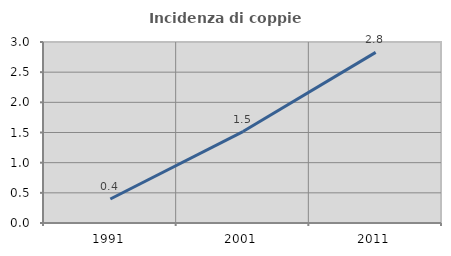
| Category | Incidenza di coppie miste |
|---|---|
| 1991.0 | 0.397 |
| 2001.0 | 1.516 |
| 2011.0 | 2.828 |